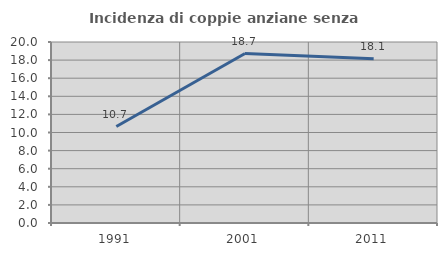
| Category | Incidenza di coppie anziane senza figli  |
|---|---|
| 1991.0 | 10.662 |
| 2001.0 | 18.725 |
| 2011.0 | 18.142 |